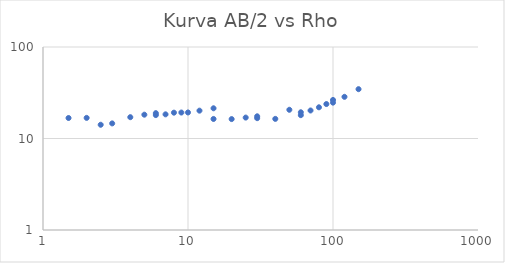
| Category | Series 0 |
|---|---|
| 1.5 | 16.75 |
| 2.0 | 16.801 |
| 2.5 | 14.13 |
| 3.0 | 14.622 |
| 4.0 | 17.097 |
| 5.0 | 18.211 |
| 6.0 | 18.933 |
| 6.0 | 18.024 |
| 7.0 | 18.367 |
| 8.0 | 19.156 |
| 9.0 | 19.221 |
| 10.0 | 19.26 |
| 12.0 | 20.154 |
| 15.0 | 21.391 |
| 15.0 | 16.35 |
| 20.0 | 16.3 |
| 25.0 | 16.934 |
| 30.0 | 16.682 |
| 30.0 | 17.486 |
| 40.0 | 16.384 |
| 50.0 | 20.603 |
| 60.0 | 19.344 |
| 60.0 | 17.99 |
| 70.0 | 20.235 |
| 80.0 | 21.926 |
| 90.0 | 23.795 |
| 100.0 | 26.37 |
| 100.0 | 24.649 |
| 120.0 | 28.547 |
| 150.0 | 34.61 |